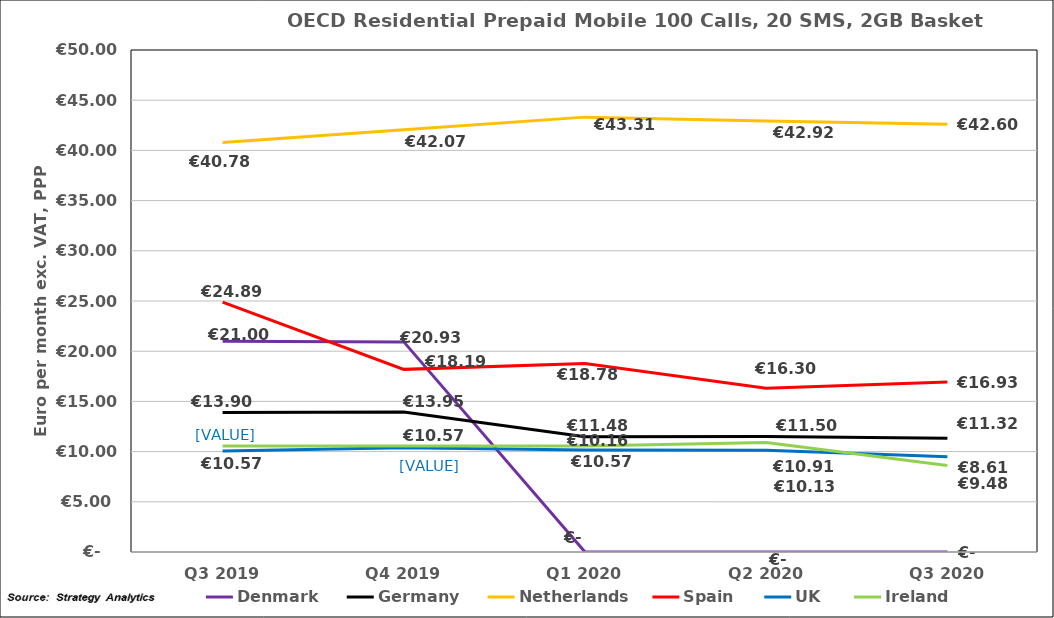
| Category | Denmark | Germany | Netherlands | Spain | UK | Ireland |
|---|---|---|---|---|---|---|
| Q3 2019 | 21 | 13.896 | 40.782 | 24.893 | 10.067 | 10.566 |
| Q4 2019 | 20.928 | 13.95 | 42.066 | 18.19 | 10.375 | 10.566 |
| Q1 2020 | 0 | 11.479 | 43.314 | 18.777 | 10.158 | 10.566 |
| Q2 2020 | 0 | 11.5 | 42.92 | 16.3 | 10.13 | 10.91 |
| Q3 2020 | 0 | 11.319 | 42.603 | 16.926 | 9.475 | 8.61 |